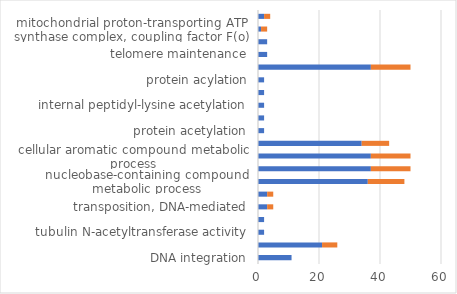
| Category | up | down |
|---|---|---|
| DNA integration | 11 | 0 |
| DNA metabolic process | 21 | 5 |
| tubulin N-acetyltransferase activity | 2 | 0 |
| alpha-tubulin acetylation | 2 | 0 |
| transposition, DNA-mediated | 3 | 2 |
| transposition | 3 | 2 |
| nucleobase-containing compound metabolic process | 36 | 12 |
| heterocycle metabolic process | 37 | 13 |
| cellular aromatic compound metabolic process | 37 | 13 |
| nucleic acid metabolic process | 34 | 9 |
| protein acetylation | 2 | 0 |
| internal protein amino acid acetylation | 2 | 0 |
| internal peptidyl-lysine acetylation | 2 | 0 |
| peptidyl-lysine acetylation | 2 | 0 |
| protein acylation | 2 | 0 |
| organic cyclic compound metabolic process | 37 | 13 |
| telomere maintenance | 3 | 0 |
| telomere organization | 3 | 0 |
| mitochondrial proton-transporting ATP synthase complex, coupling factor F(o) | 1 | 2 |
| transposase activity | 2 | 2 |